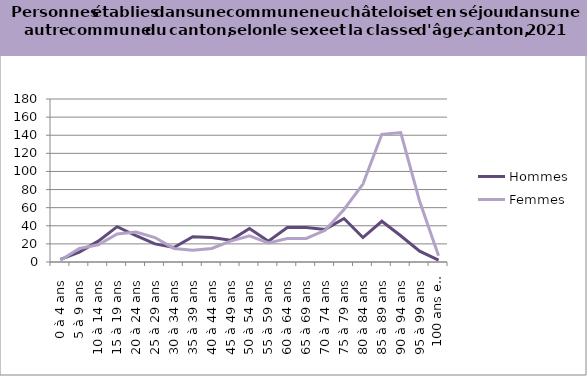
| Category | Hommes | Femmes |
|---|---|---|
| 0 à 4 ans | 3 | 2 |
| 5 à 9 ans | 11 | 15 |
| 10 à 14 ans | 23 | 19 |
| 15 à 19 ans | 39 | 31 |
| 20 à 24 ans | 29 | 33 |
| 25 à 29 ans | 20 | 27 |
| 30 à 34 ans | 16 | 15 |
| 35 à 39 ans | 28 | 13 |
| 40 à 44 ans | 27 | 15 |
| 45 à 49 ans | 24 | 23 |
| 50 à 54 ans | 37 | 29 |
| 55 à 59 ans | 23 | 21 |
| 60 à 64 ans | 38 | 26 |
| 65 à 69 ans | 38 | 26 |
| 70 à 74 ans | 36 | 35 |
| 75 à 79 ans | 48 | 58 |
| 80 à 84 ans | 27 | 86 |
| 85 à 89 ans | 45 | 141 |
| 90 à 94 ans | 29 | 143 |
| 95 à 99 ans | 12 | 67 |
| 100 ans et plus | 2 | 7 |